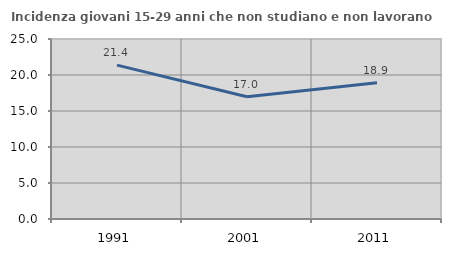
| Category | Incidenza giovani 15-29 anni che non studiano e non lavorano  |
|---|---|
| 1991.0 | 21.377 |
| 2001.0 | 16.981 |
| 2011.0 | 18.936 |